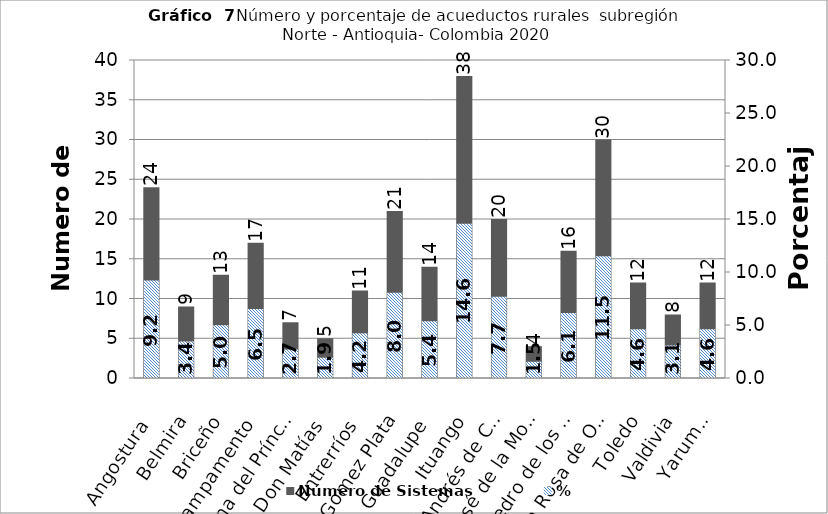
| Category | Número de Sistemas |
|---|---|
| Angostura | 24 |
| Belmira | 9 |
| Briceño | 13 |
| Campamento | 17 |
| Carolina del Príncipe | 7 |
| Don Matías | 5 |
| Entrerríos | 11 |
| Gómez Plata | 21 |
| Guadalupe | 14 |
| Ituango | 38 |
| San Andrés de Cuerquia | 20 |
| San José de la Montaña | 4 |
| San Pedro de los Milagros | 16 |
| Santa Rosa de Osos | 30 |
| Toledo | 12 |
| Valdivia | 8 |
| Yarumal | 12 |